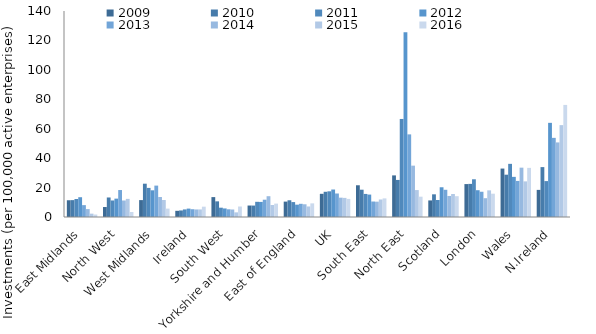
| Category | 2009 | 2010 | 2011 | 2012 | 2013 | 2014 | 2015 | 2016 |
|---|---|---|---|---|---|---|---|---|
| East Midlands | 11.384 | 11.463 | 12.237 | 13.445 | 8.07 | 5.378 | 2.27 | 1.675 |
| North West | 6.777 | 13.263 | 11.239 | 12.478 | 18.328 | 11.224 | 12.32 | 3.405 |
| West Midlands | 11.485 | 22.634 | 19.779 | 18.141 | 21.34 | 13.584 | 11.54 | 5.696 |
| Ireland | 4.2 | 4.447 | 5.147 | 5.707 | 5.285 | 5.121 | 5.144 | 7.014 |
| South West | 13.523 | 10.636 | 6.327 | 5.818 | 5.23 | 5.095 | 3.153 | 7.128 |
| Yorkshire and Humber | 7.793 | 7.773 | 10.327 | 10.251 | 11.751 | 14.137 | 8.146 | 9.099 |
| East of England | 10.463 | 11.373 | 10.143 | 8.384 | 8.964 | 8.65 | 7.16 | 9.262 |
| UK | 15.756 | 17.139 | 17.459 | 18.669 | 15.967 | 13.133 | 12.986 | 12.29 |
| South East | 21.566 | 18.552 | 15.676 | 15.238 | 10.521 | 10.42 | 11.897 | 12.649 |
| North East | 28.275 | 25.191 | 66.624 | 125.539 | 56.154 | 34.896 | 18.307 | 13.801 |
| Scotland | 11.264 | 15.415 | 11.564 | 20.212 | 18.492 | 14.298 | 15.617 | 14.141 |
| London | 22.371 | 22.504 | 25.642 | 18.206 | 17.162 | 12.779 | 18.104 | 15.838 |
| Wales | 32.922 | 28.75 | 36.121 | 27.277 | 24.513 | 33.533 | 24.208 | 33.384 |
| N.Ireland | 18.425 | 33.907 | 24.403 | 63.994 | 53.783 | 50.688 | 62.433 | 76.158 |